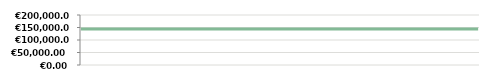
| Category | VUOSI   |
|---|---|
| 2013-04-23 | 143800 |
| 2013-04-25 | 143800 |
| 2013-05-07 | 143800 |
| 2013-05-14 | 143800 |
| 2013-05-14 | 143800 |
| 2013-05-29 | 143800 |
| 2013-06-10 | 143800 |
| 2013-06-21 | 143800 |
| 2013-07-06 | 143800 |
| 2013-08-05 | 143800 |
| 2013-08-19 | 143800 |
| 2013-09-04 | 143800 |
| 2013-09-20 | 143800 |
| 2013-09-25 | 143800 |
| 2013-10-15 | 143800 |
| 2013-11-05 | 143800 |
| 2013-11-26 | 143800 |
| 2013-11-30 | 143800 |
| 2013-12-11 | 143800 |